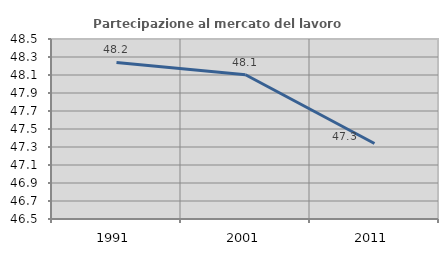
| Category | Partecipazione al mercato del lavoro  femminile |
|---|---|
| 1991.0 | 48.24 |
| 2001.0 | 48.103 |
| 2011.0 | 47.339 |